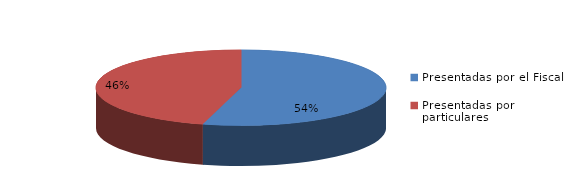
| Category | Series 0 |
|---|---|
| Presentadas por el Fiscal | 603 |
| Presentadas por particulares | 509 |